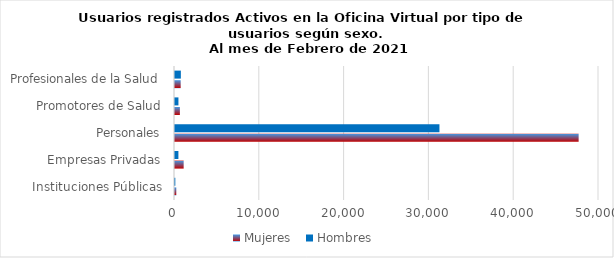
| Category | Mujeres | Hombres |
|---|---|---|
| Instituciones Públicas | 153 | 38 |
| Empresas Privadas | 1021 | 401 |
| Personales | 47599 | 31185 |
| Promotores de Salud | 575 | 405 |
| Profesionales de la Salud | 670 | 690 |